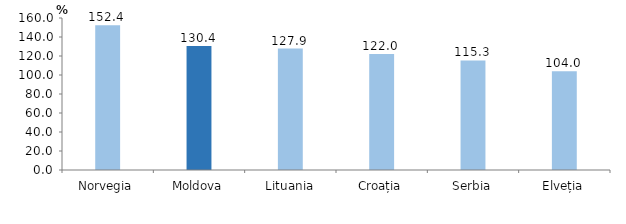
| Category | Indicilor preţurilor producţiei industriale, septembrie 2022 comparativ cu septembrie 2021 |
|---|---|
| Norvegia | 152.362 |
| Moldova | 130.4 |
| Lituania | 127.854 |
| Croația | 121.974 |
| Serbia | 115.331 |
| Elveția | 104.016 |